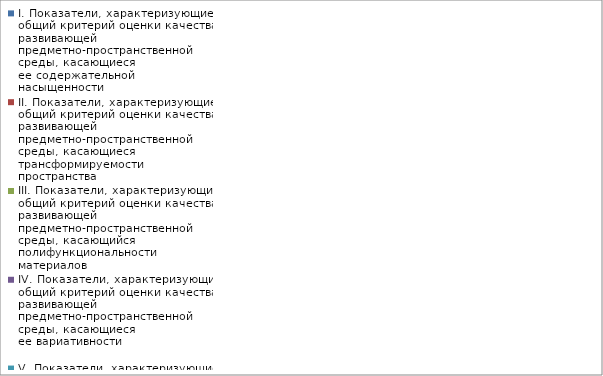
| Category | I. Показатели, характеризующие общий критерий оценки качества развивающей предметно-пространственной среды, касающиеся ее содержательной насыщенности | II. Показатели, характеризующие общий критерий оценки качества развивающей предметно-пространственной среды, касающиеся трансформируемости пространства | III. Показатели, характеризующие общий критерий оценки качества развивающей предметно-пространственной среды, касающийся полифункциональности материалов | IV. Показатели, характеризующие общий критерий оценки качества развивающей предметно-пространственной среды, касающиеся ее вариативности | V. Показатели, характеризующие общий критерий оценки качества развивающей предметно-пространственной среды, касающиеся ее доступности | VI. Показатели, характеризующие общий критерий оценки качества развивающей предметно-пространственной среды, касающиеся безопасности предметно-пространственной среды |
|---|---|---|---|---|---|---|
| Медвежата | 1 | 0.833 | 0.778 | 0.944 | 1 | 0.85 |